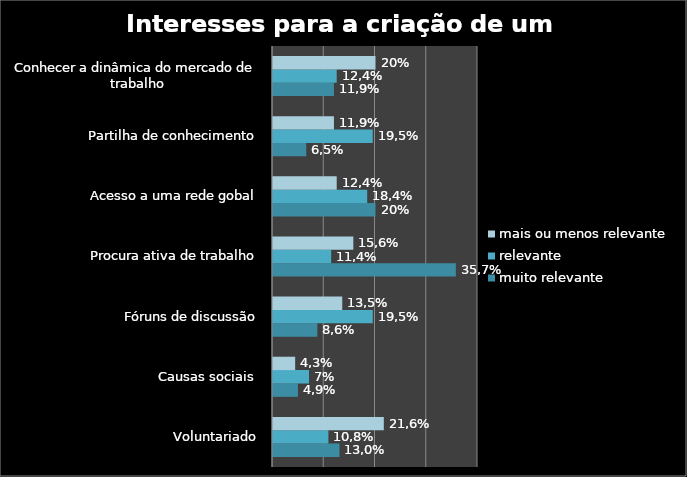
| Category | muito relevante | relevante | mais ou menos relevante |
|---|---|---|---|
| Voluntariado | 12.973 | 10.811 | 21.622 |
| Causas sociais  | 4.865 | 7.027 | 4.324 |
| Fóruns de discussão | 8.649 | 19.459 | 13.514 |
| Procura ativa de trabalho | 35.676 | 11.351 | 15.676 |
| Acesso a uma rede gobal | 20 | 18.378 | 12.432 |
| Partilha de conhecimento | 6.486 | 19.459 | 11.892 |
| Conhecer a dinâmica do mercado de trabalho | 11.892 | 12.432 | 20 |